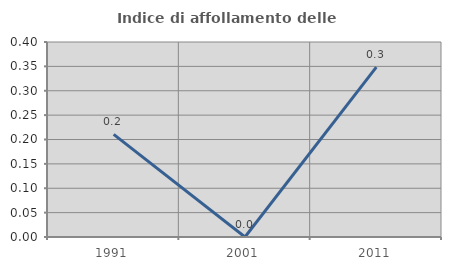
| Category | Indice di affollamento delle abitazioni  |
|---|---|
| 1991.0 | 0.211 |
| 2001.0 | 0 |
| 2011.0 | 0.348 |